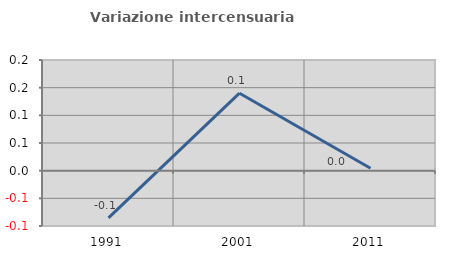
| Category | Variazione intercensuaria annua |
|---|---|
| 1991.0 | -0.085 |
| 2001.0 | 0.14 |
| 2011.0 | 0.004 |